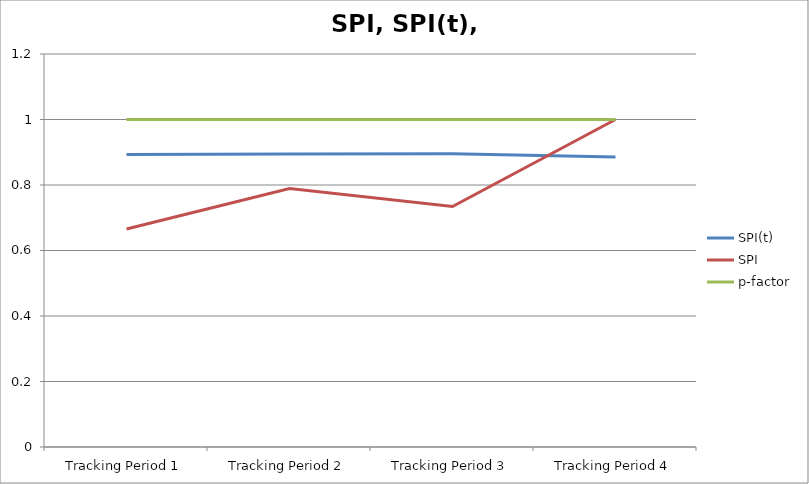
| Category | SPI(t) | SPI | p-factor |
|---|---|---|---|
| Tracking Period 1 | 0.893 | 0.666 | 1 |
| Tracking Period 2 | 0.895 | 0.789 | 1 |
| Tracking Period 3 | 0.895 | 0.734 | 1 |
| Tracking Period 4 | 0.885 | 1 | 1 |